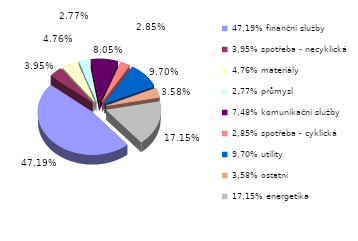
| Category | Series 0 |
|---|---|
| 47,19% finanční služby | 0.472 |
| 3,95% spotřeba - necyklická | 0.04 |
| 4,76% materiály | 0.048 |
| 2,77% průmysl | 0.028 |
| 7,48% komunikační služby | 0.08 |
| 2,85% spotřeba - cyklická | 0.028 |
| 9,70% utility | 0.097 |
| 3,58% ostatní | 0.036 |
| 17,15% energetika | 0.172 |